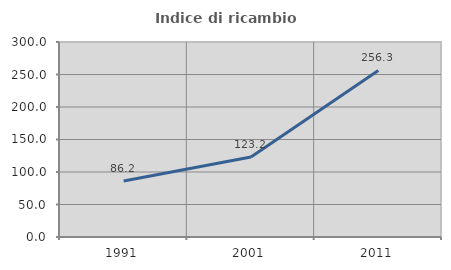
| Category | Indice di ricambio occupazionale  |
|---|---|
| 1991.0 | 86.179 |
| 2001.0 | 123.151 |
| 2011.0 | 256.303 |